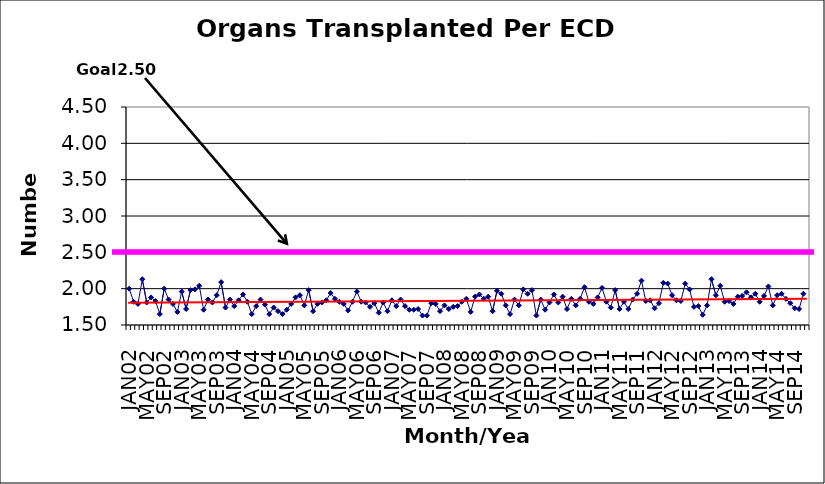
| Category | Series 0 |
|---|---|
| JAN02 | 2 |
| FEB02 | 1.82 |
| MAR02 | 1.79 |
| APR02 | 2.13 |
| MAY02 | 1.81 |
| JUN02 | 1.88 |
| JUL02 | 1.83 |
| AUG02 | 1.65 |
| SEP02 | 2 |
| OCT02 | 1.85 |
| NOV02 | 1.79 |
| DEC02 | 1.68 |
| JAN03 | 1.96 |
| FEB03 | 1.72 |
| MAR03 | 1.98 |
| APR03 | 1.99 |
| MAY03 | 2.04 |
| JUN03 | 1.71 |
| JUL03 | 1.85 |
| AUG03 | 1.81 |
| SEP03 | 1.91 |
| OCT03 | 2.09 |
| NOV03 | 1.74 |
| DEC03 | 1.85 |
| JAN04 | 1.76 |
| FEB04 | 1.84 |
| MAR04 | 1.92 |
| APR04 | 1.82 |
| MAY04 | 1.65 |
| JUN04 | 1.76 |
| JUL04 | 1.85 |
| AUG04 | 1.78 |
| SEP04 | 1.65 |
| OCT04 | 1.74 |
| NOV04 | 1.69 |
| DEC04 | 1.65 |
| JAN05 | 1.71 |
| FEB05 | 1.79 |
| MAR05 | 1.88 |
| APR05 | 1.91 |
| MAY05 | 1.77 |
| JUN05 | 1.98 |
| JUL05 | 1.69 |
| AUG05 | 1.79 |
| SEP05 | 1.81 |
| OCT05 | 1.84 |
| NOV05 | 1.94 |
| DEC05 | 1.86 |
| JAN06 | 1.82 |
| FEB06 | 1.79 |
| MAR06 | 1.7 |
| APR06 | 1.82 |
| MAY06 | 1.96 |
| JUN06 | 1.82 |
| JUL06 | 1.81 |
| AUG06 | 1.75 |
| SEP06 | 1.8 |
| OCT06 | 1.67 |
| NOV06 | 1.81 |
| DEC06 | 1.69 |
| JAN07 | 1.84 |
| FEB07 | 1.76 |
| MAR07 | 1.85 |
| APR07 | 1.76 |
| MAY07 | 1.71 |
| JUN07 | 1.71 |
| JUL07 | 1.72 |
| AUG07 | 1.63 |
| SEP07 | 1.63 |
| OCT07 | 1.8 |
| NOV07 | 1.79 |
| DEC07 | 1.69 |
| JAN08 | 1.77 |
| FEB08 | 1.72 |
| MAR08 | 1.75 |
| APR08 | 1.76 |
| MAY08 | 1.82 |
| JUN08 | 1.86 |
| JUL08 | 1.68 |
| AUG08 | 1.89 |
| SEP08 | 1.92 |
| OCT08 | 1.86 |
| NOV08 | 1.89 |
| DEC08 | 1.69 |
| JAN09 | 1.97 |
| FEB09 | 1.93 |
| MAR09 | 1.77 |
| APR09 | 1.65 |
| MAY09 | 1.85 |
| JUN09 | 1.77 |
| JUL09 | 1.99 |
| AUG09 | 1.93 |
| SEP09 | 1.98 |
| OCT09 | 1.63 |
| NOV09 | 1.85 |
| DEC09 | 1.71 |
| JAN10 | 1.81 |
| FEB10 | 1.92 |
| MAR10 | 1.81 |
| APR10 | 1.89 |
| MAY10 | 1.72 |
| JUN10 | 1.86 |
| JUL10 | 1.77 |
| AUG10 | 1.86 |
| SEP10 | 2.02 |
| OCT10 | 1.82 |
| NOV10 | 1.79 |
| DEC10 | 1.88 |
| JAN11 | 2.01 |
| FEB11 | 1.82 |
| MAR11 | 1.74 |
| APR11 | 1.98 |
| MAY11 | 1.72 |
| JUN11 | 1.82 |
| JUL11 | 1.72 |
| AUG11 | 1.85 |
| SEP11 | 1.93 |
| OCT11 | 2.11 |
| NOV11 | 1.83 |
| DEC11 | 1.84 |
| JAN12 | 1.73 |
| FEB12 | 1.8 |
| MAR12 | 2.08 |
| APR12 | 2.07 |
| MAY12 | 1.91 |
| JUN12 | 1.84 |
| JUL12 | 1.83 |
| AUG12 | 2.07 |
| SEP12 | 1.99 |
| OCT12 | 1.75 |
| NOV12 | 1.76 |
| DEC12 | 1.64 |
| JAN13 | 1.77 |
| FEB13 | 2.13 |
| MAR13 | 1.91 |
| APR13 | 2.04 |
| MAY13 | 1.82 |
| JUN13 | 1.83 |
| JUL13 | 1.79 |
| AUG13 | 1.89 |
| SEP13 | 1.9 |
| OCT13 | 1.95 |
| NOV13 | 1.88 |
| DEC13 | 1.93 |
| JAN14 | 1.82 |
| FEB14 | 1.9 |
| MAR14 | 2.03 |
| APR14 | 1.77 |
| MAY14 | 1.91 |
| JUN14 | 1.93 |
| JUL14 | 1.86 |
| AUG14 | 1.8 |
| SEP14 | 1.73 |
| OCT14 | 1.72 |
| NOV14 | 1.93 |